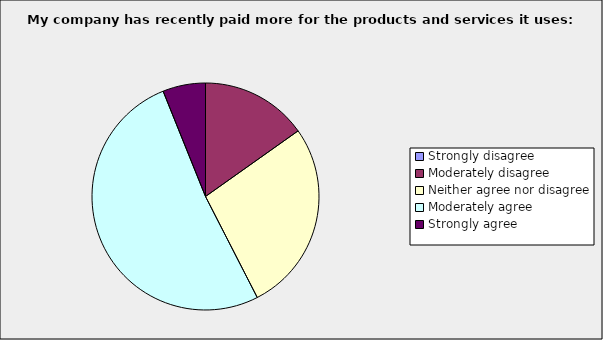
| Category | Series 0 |
|---|---|
| Strongly disagree | 0 |
| Moderately disagree | 0.152 |
| Neither agree nor disagree | 0.273 |
| Moderately agree | 0.515 |
| Strongly agree | 0.061 |